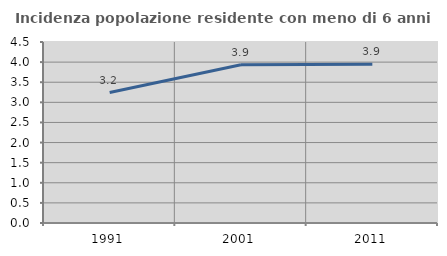
| Category | Incidenza popolazione residente con meno di 6 anni |
|---|---|
| 1991.0 | 3.243 |
| 2001.0 | 3.936 |
| 2011.0 | 3.945 |